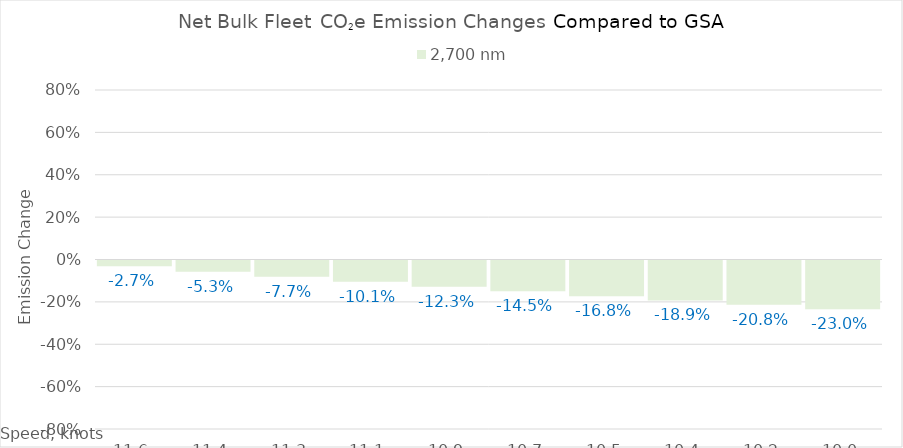
| Category | 2,700 |
|---|---|
| 11.620000000000001 | -0.027 |
| 11.440000000000001 | -0.053 |
| 11.260000000000002 | -0.077 |
| 11.080000000000002 | -0.101 |
| 10.900000000000002 | -0.123 |
| 10.720000000000002 | -0.145 |
| 10.540000000000003 | -0.168 |
| 10.360000000000003 | -0.189 |
| 10.180000000000003 | -0.208 |
| 10.000000000000004 | -0.23 |